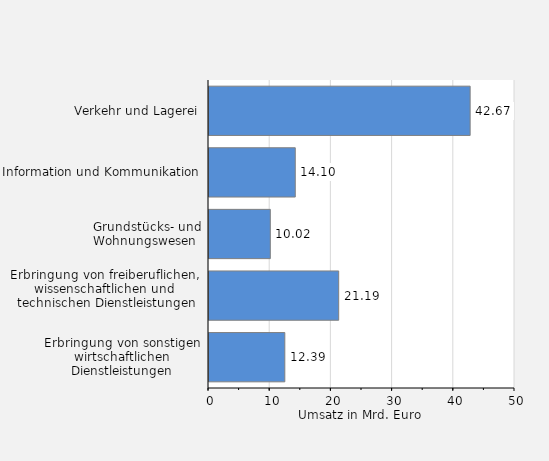
| Category | Umsatz in Mrd. Euro |
|---|---|
| Verkehr und Lagerei | 42.672 |
| Information und Kommunikation | 14.096 |
| Grundstücks- und Wohnungswesen  | 10.019 |
| Erbringung von freiberuflichen, 
wissenschaftlichen und 
technischen Dienstleistungen | 21.192 |
| Erbringung von sonstigen wirtschaftlichen Dienstleistungen | 12.388 |